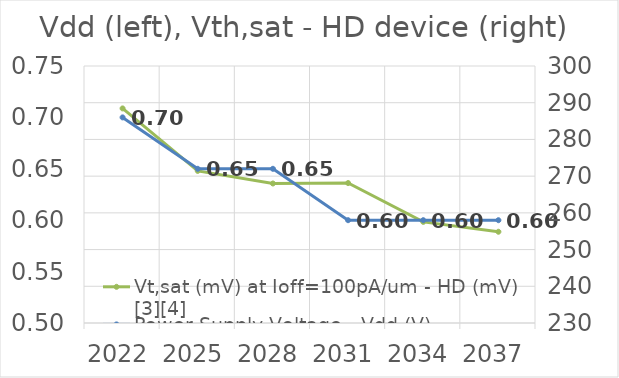
| Category | Vt,sat (mV) at Ioff=100pA/um - HD (mV) [3][4] |
|---|---|
| 2022.0 | 288.447 |
| 2025.0 | 271.427 |
| 2028.0 | 268 |
| 2031.0 | 268.121 |
| 2034.0 | 257.544 |
| 2037.0 | 254.853 |